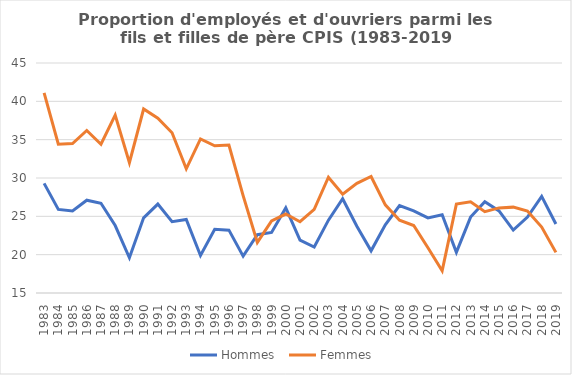
| Category | Hommes  | Femmes  |
|---|---|---|
| 1983.0 | 29.3 | 41.1 |
| 1984.0 | 25.9 | 34.4 |
| 1985.0 | 25.7 | 34.5 |
| 1986.0 | 27.1 | 36.2 |
| 1987.0 | 26.7 | 34.4 |
| 1988.0 | 23.8 | 38.2 |
| 1989.0 | 19.6 | 32 |
| 1990.0 | 24.8 | 39 |
| 1991.0 | 26.6 | 37.8 |
| 1992.0 | 24.3 | 35.9 |
| 1993.0 | 24.6 | 31.2 |
| 1994.0 | 19.9 | 35.1 |
| 1995.0 | 23.3 | 34.2 |
| 1996.0 | 23.2 | 34.3 |
| 1997.0 | 19.8 | 27.7 |
| 1998.0 | 22.6 | 21.6 |
| 1999.0 | 22.9 | 24.4 |
| 2000.0 | 26.1 | 25.3 |
| 2001.0 | 21.9 | 24.3 |
| 2002.0 | 21 | 25.9 |
| 2003.0 | 24.5 | 30.1 |
| 2004.0 | 27.3 | 27.9 |
| 2005.0 | 23.7 | 29.3 |
| 2006.0 | 20.5 | 30.2 |
| 2007.0 | 23.9 | 26.5 |
| 2008.0 | 26.4 | 24.5 |
| 2009.0 | 25.7 | 23.8 |
| 2010.0 | 24.8 | 20.9 |
| 2011.0 | 25.2 | 17.9 |
| 2012.0 | 20.3 | 26.6 |
| 2013.0 | 24.9 | 26.9 |
| 2014.0 | 26.9 | 25.6 |
| 2015.0 | 25.7 | 26.1 |
| 2016.0 | 23.2 | 26.2 |
| 2017.0 | 24.9 | 25.7 |
| 2018.0 | 27.6 | 23.6 |
| 2019.0 | 24 | 20.3 |